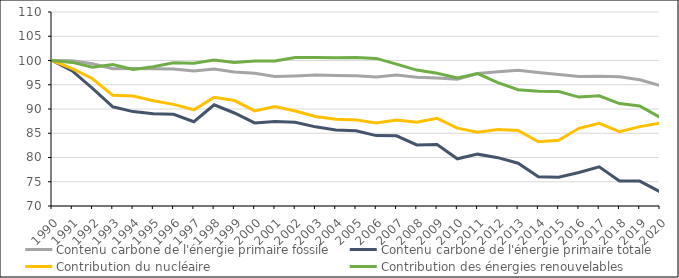
| Category | Contenu carbone de l'énergie primaire fossile | Contenu carbone de l'énergie primaire totale | Contribution du nucléaire | Contribution des énergies renouvelables |
|---|---|---|---|---|
| 1990.0 | 100 | 100 | 100 | 100 |
| 1991.0 | 99.923 | 97.856 | 98.318 | 99.606 |
| 1992.0 | 99.331 | 94.245 | 96.232 | 98.594 |
| 1993.0 | 98.295 | 90.456 | 92.811 | 99.153 |
| 1994.0 | 98.339 | 89.466 | 92.671 | 98.172 |
| 1995.0 | 98.312 | 89.01 | 91.707 | 98.725 |
| 1996.0 | 98.231 | 88.918 | 90.949 | 99.528 |
| 1997.0 | 97.815 | 87.372 | 89.837 | 99.429 |
| 1998.0 | 98.232 | 90.876 | 92.42 | 100.099 |
| 1999.0 | 97.619 | 89.176 | 91.743 | 99.573 |
| 2000.0 | 97.352 | 87.136 | 89.608 | 99.886 |
| 2001.0 | 96.695 | 87.403 | 90.5 | 99.879 |
| 2002.0 | 96.822 | 87.28 | 89.593 | 100.616 |
| 2003.0 | 96.984 | 86.321 | 88.46 | 100.616 |
| 2004.0 | 96.903 | 85.652 | 87.895 | 100.563 |
| 2005.0 | 96.865 | 85.524 | 87.755 | 100.612 |
| 2006.0 | 96.613 | 84.511 | 87.1 | 100.429 |
| 2007.0 | 96.988 | 84.466 | 87.738 | 99.26 |
| 2008.0 | 96.541 | 82.599 | 87.282 | 98.025 |
| 2009.0 | 96.403 | 82.667 | 88.082 | 97.353 |
| 2010.0 | 96.12 | 79.728 | 86.048 | 96.395 |
| 2011.0 | 97.311 | 80.69 | 85.225 | 97.295 |
| 2012.0 | 97.674 | 79.966 | 85.768 | 95.455 |
| 2013.0 | 98.008 | 78.828 | 85.583 | 93.979 |
| 2014.0 | 97.539 | 76.023 | 83.238 | 93.636 |
| 2015.0 | 97.133 | 75.949 | 83.546 | 93.589 |
| 2016.0 | 96.724 | 76.922 | 86.016 | 92.457 |
| 2017.0 | 96.736 | 78.081 | 87.037 | 92.736 |
| 2018.0 | 96.633 | 75.137 | 85.339 | 91.112 |
| 2019.0 | 96.013 | 75.14 | 86.368 | 90.612 |
| 2020.0 | 94.832 | 72.937 | 87.108 | 88.295 |